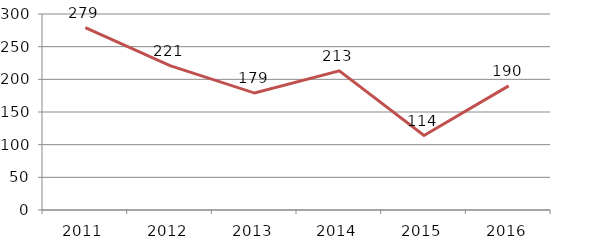
| Category | Total |
|---|---|
| 2011.0 | 279 |
| 2012.0 | 221 |
| 2013.0 | 179 |
| 2014.0 | 213 |
| 2015.0 | 114 |
| 2016.0 | 190 |